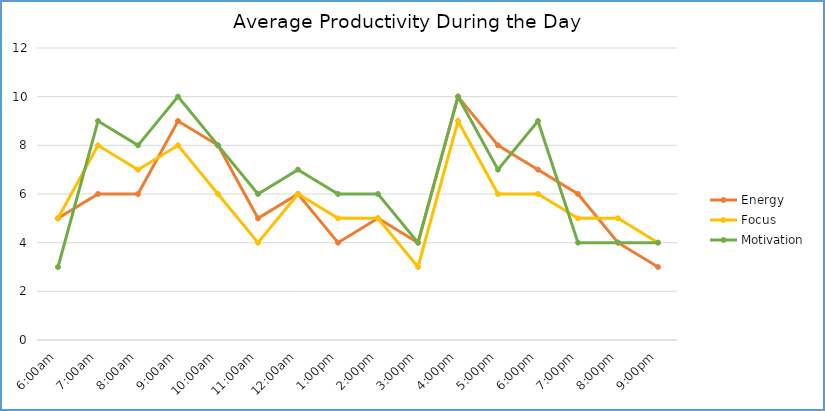
| Category | Energy | Focus | Motivation |
|---|---|---|---|
| 6:00am | 5 | 5 | 3 |
| 7:00am | 6 | 8 | 9 |
| 8:00am | 6 | 7 | 8 |
| 9:00am | 9 | 8 | 10 |
| 10:00am | 8 | 6 | 8 |
| 11:00am | 5 | 4 | 6 |
| 12:00am | 6 | 6 | 7 |
| 1:00pm | 4 | 5 | 6 |
| 2:00pm | 5 | 5 | 6 |
| 3:00pm | 4 | 3 | 4 |
| 4:00pm | 10 | 9 | 10 |
| 5:00pm | 8 | 6 | 7 |
| 6:00pm | 7 | 6 | 9 |
| 7:00pm | 6 | 5 | 4 |
| 8:00pm | 4 | 5 | 4 |
| 9:00pm | 3 | 4 | 4 |